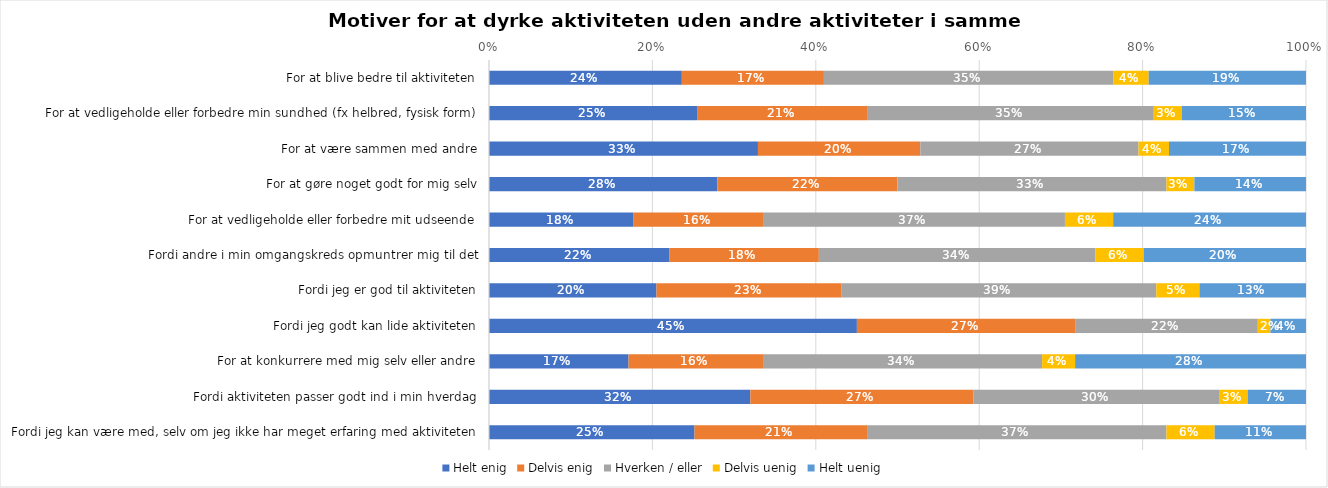
| Category | Helt enig | Delvis enig | Hverken / eller | Delvis uenig | Helt uenig |
|---|---|---|---|---|---|
| For at blive bedre til aktiviteten | 0.236 | 0.174 | 0.354 | 0.043 | 0.193 |
| For at vedligeholde eller forbedre min sundhed (fx helbred, fysisk form) | 0.255 | 0.208 | 0.351 | 0.034 | 0.152 |
| For at være sammen med andre | 0.329 | 0.199 | 0.267 | 0.037 | 0.168 |
| For at gøre noget godt for mig selv | 0.28 | 0.22 | 0.329 | 0.034 | 0.137 |
| For at vedligeholde eller forbedre mit udseende | 0.177 | 0.158 | 0.37 | 0.059 | 0.236 |
| Fordi andre i min omgangskreds opmuntrer mig til det | 0.22 | 0.183 | 0.339 | 0.059 | 0.199 |
| Fordi jeg er god til aktiviteten | 0.205 | 0.227 | 0.385 | 0.053 | 0.13 |
| Fordi jeg godt kan lide aktiviteten | 0.45 | 0.267 | 0.224 | 0.016 | 0.043 |
| For at konkurrere med mig selv eller andre | 0.171 | 0.165 | 0.342 | 0.04 | 0.283 |
| Fordi aktiviteten passer godt ind i min hverdag | 0.32 | 0.273 | 0.301 | 0.034 | 0.071 |
| Fordi jeg kan være med, selv om jeg ikke har meget erfaring med aktiviteten | 0.252 | 0.211 | 0.366 | 0.059 | 0.112 |